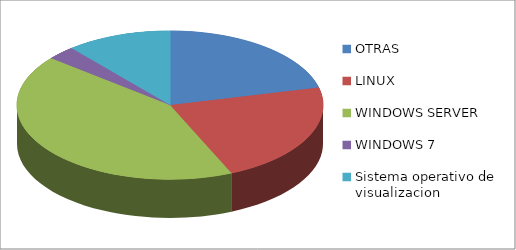
| Category | Series 0 |
|---|---|
| OTRAS | 0.21 |
| LINUX | 0.22 |
| WINDOWS SERVER | 0.42 |
| WINDOWS 7 | 0.03 |
| Sistema operativo de visualizacion | 0.11 |